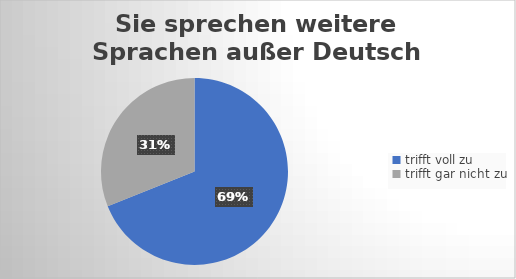
| Category | Sie sprechen weitere Sprachen außer Deutsch und Englisch. |
|---|---|
| trifft voll zu | 193 |
| trifft gar nicht zu | 87 |